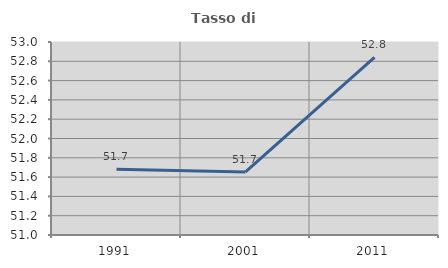
| Category | Tasso di occupazione   |
|---|---|
| 1991.0 | 51.682 |
| 2001.0 | 51.653 |
| 2011.0 | 52.841 |